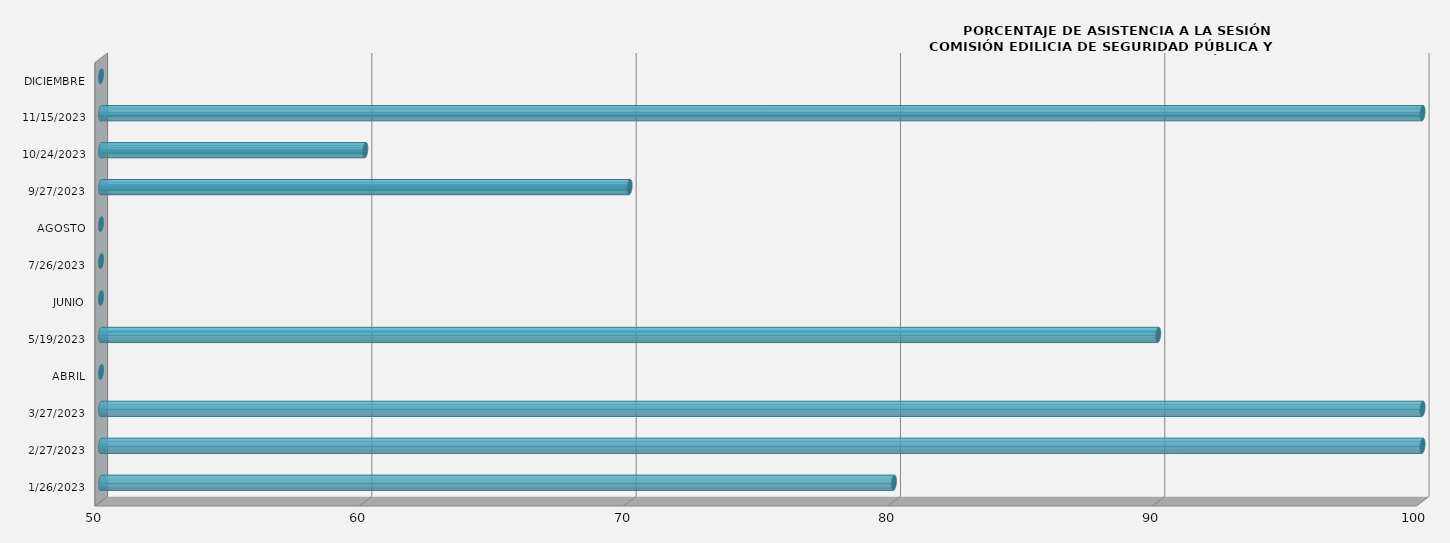
| Category | 26/01/2023 |
|---|---|
| 26/01/2023 | 80 |
| 27/02/2023 | 100 |
| 27/03/2023 | 100 |
| ABRIL | 0 |
| 19/05/2023 | 90 |
| JUNIO | 0 |
| 26/07/2023 | 0 |
| AGOSTO | 0 |
| 27/09/2023 | 70 |
| 24/10/2023 | 60 |
| 15/11/2023 | 100 |
| DICIEMBRE | 0 |